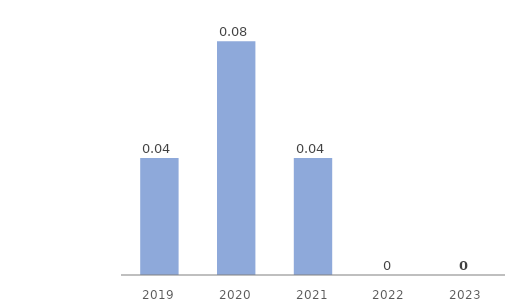
| Category | Assets in Kazakhstan |
|---|---|
| 2019.0 | 0.04 |
| 2020.0 | 0.08 |
| 2021.0 | 0.04 |
| 2022.0 | 0 |
| 2023.0 | 0 |